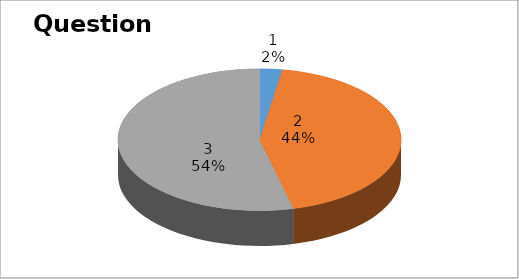
| Category | Series 0 |
|---|---|
| 0 | 1 |
| 1 | 17 |
| 2 | 21 |